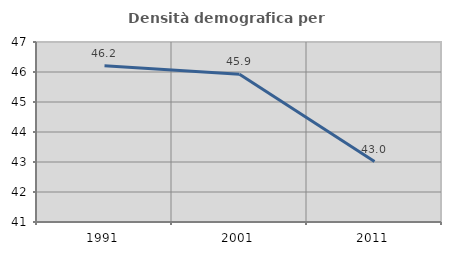
| Category | Densità demografica |
|---|---|
| 1991.0 | 46.205 |
| 2001.0 | 45.927 |
| 2011.0 | 43.016 |